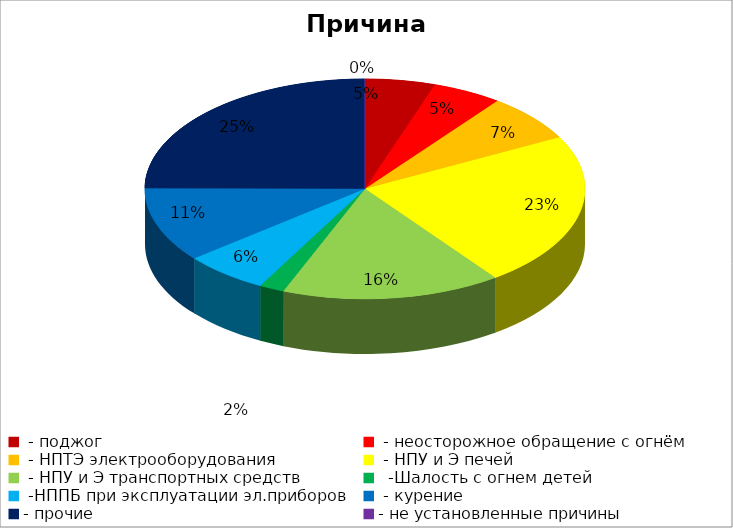
| Category | Причина пожара |
|---|---|
|  - поджог | 14 |
|  - неосторожное обращение с огнём | 14 |
|  - НПТЭ электрооборудования | 19 |
|  - НПУ и Э печей | 62 |
|  - НПУ и Э транспортных средств | 44 |
|   -Шалость с огнем детей | 5 |
|  -НППБ при эксплуатации эл.приборов | 17 |
|  - курение | 30 |
| - прочие | 68 |
| - не установленные причины | 0 |